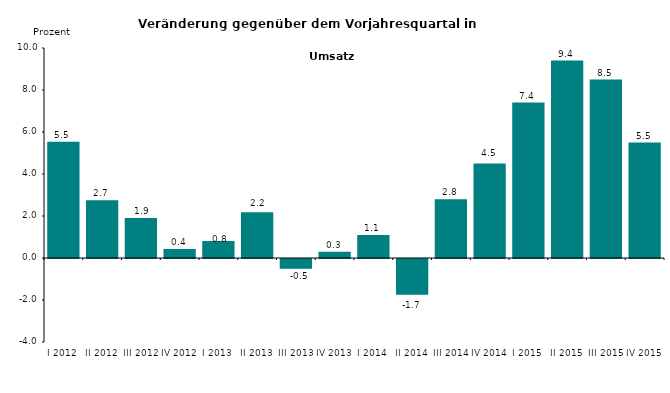
| Category | Series 0 |
|---|---|
| I 2012 | 5.54 |
| II 2012 | 2.745 |
| III 2012 | 1.908 |
| IV 2012 | 0.427 |
| I 2013 | 0.81 |
| II 2013 | 2.181 |
| III 2013 | -0.465 |
| IV 2013 | 0.3 |
| I 2014 | 1.1 |
| II 2014 | -1.7 |
| III 2014 | 2.8 |
| IV 2014 | 4.5 |
| I 2015 | 7.4 |
| II 2015 | 9.4 |
| III 2015 | 8.5 |
| IV 2015 | 5.5 |